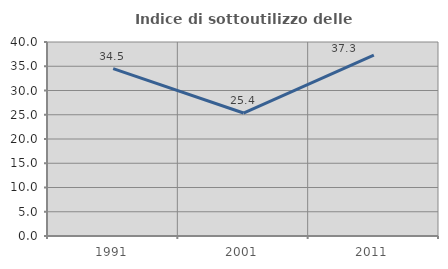
| Category | Indice di sottoutilizzo delle abitazioni  |
|---|---|
| 1991.0 | 34.524 |
| 2001.0 | 25.352 |
| 2011.0 | 37.313 |